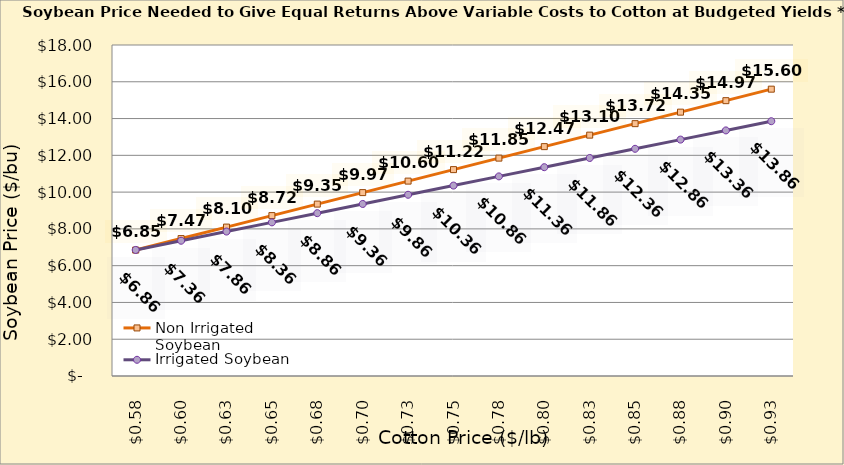
| Category | Non Irrigated Soybean | Irrigated Soybean |
|---|---|---|
| 0.5749999999999998 | 6.848 | 6.855 |
| 0.5999999999999999 | 7.473 | 7.355 |
| 0.6249999999999999 | 8.098 | 7.855 |
| 0.6499999999999999 | 8.723 | 8.355 |
| 0.6749999999999999 | 9.348 | 8.855 |
| 0.7 | 9.973 | 9.355 |
| 0.725 | 10.598 | 9.855 |
| 0.75 | 11.223 | 10.355 |
| 0.775 | 11.848 | 10.855 |
| 0.8 | 12.473 | 11.355 |
| 0.8250000000000001 | 13.098 | 11.855 |
| 0.8500000000000001 | 13.723 | 12.355 |
| 0.8750000000000001 | 14.348 | 12.855 |
| 0.9000000000000001 | 14.973 | 13.355 |
| 0.9250000000000002 | 15.598 | 13.855 |